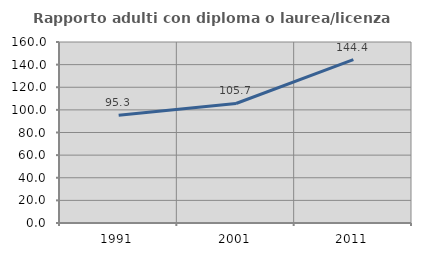
| Category | Rapporto adulti con diploma o laurea/licenza media  |
|---|---|
| 1991.0 | 95.299 |
| 2001.0 | 105.655 |
| 2011.0 | 144.35 |